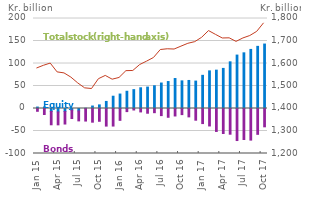
| Category | Equity | Bonds |
|---|---|---|
| 2015-01-01 | 3.2 | -6.2 |
| 2015-02-01 | 3.3 | -13.3 |
| 2015-03-01 | -6.6 | -29.6 |
| 2015-04-01 | -7.7 | -28.6 |
| 2015-05-01 | -6.8 | -27.7 |
| 2015-06-01 | -3.7 | -18.6 |
| 2015-07-01 | -5.4 | -22.1 |
| 2015-08-01 | 0.7 | -27.9 |
| 2015-09-01 | 5.5 | -30.4 |
| 2015-10-01 | 8 | -28.4 |
| 2015-11-01 | 15.7 | -39.1 |
| 2015-12-01 | 27.3 | -39 |
| 2016-01-01 | 32.1 | -26.3 |
| 2016-02-01 | 38.3 | -6.9 |
| 2016-03-01 | 41.9 | -3.3 |
| 2016-04-01 | 46 | -7.6 |
| 2016-05-01 | 47.6 | -10.5 |
| 2016-06-01 | 50.5 | -9.3 |
| 2016-07-01 | 56.6 | -15.8 |
| 2016-08-01 | 59.9 | -19.5 |
| 2016-09-01 | 66.6 | -16.6 |
| 2016-10-01 | 61.4 | -13.6 |
| 2016-11-01 | 62.3 | -18.6 |
| 2016-12-01 | 60.9 | -26 |
| 2017-01-01 | 73.7 | -33.5 |
| 2017-02-01 | 83.6 | -38.8 |
| 2017-03-01 | 85.2 | -51 |
| 2017-04-01 | 89.1 | -55.5 |
| 2017-05-01 | 103.7 | -57.1 |
| 2017-06-01 | 118.7 | -71.2 |
| 2017-07-01 | 123.7 | -68.9 |
| 2017-08-01 | 131.3 | -70.2 |
| 2017-09-01 | 138.1 | -57.4 |
| 2017-10-01 | 143.2 | -40.7 |